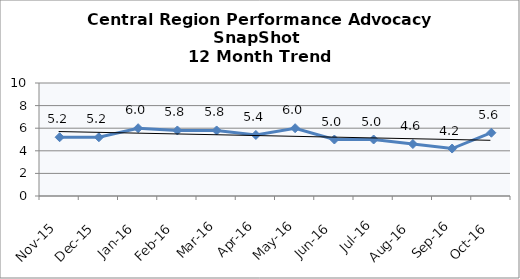
| Category | Central Region |
|---|---|
| Nov-15 | 5.2 |
| Dec-15 | 5.2 |
| Jan-16 | 6 |
| Feb-16 | 5.8 |
| Mar-16 | 5.8 |
| Apr-16 | 5.4 |
| May-16 | 6 |
| Jun-16 | 5 |
| Jul-16 | 5 |
| Aug-16 | 4.6 |
| Sep-16 | 4.2 |
| Oct-16 | 5.6 |